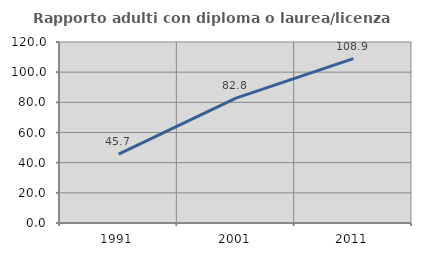
| Category | Rapporto adulti con diploma o laurea/licenza media  |
|---|---|
| 1991.0 | 45.732 |
| 2001.0 | 82.805 |
| 2011.0 | 108.949 |